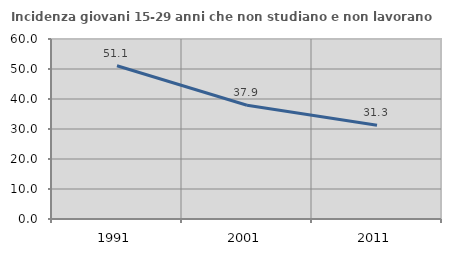
| Category | Incidenza giovani 15-29 anni che non studiano e non lavorano  |
|---|---|
| 1991.0 | 51.07 |
| 2001.0 | 37.92 |
| 2011.0 | 31.276 |